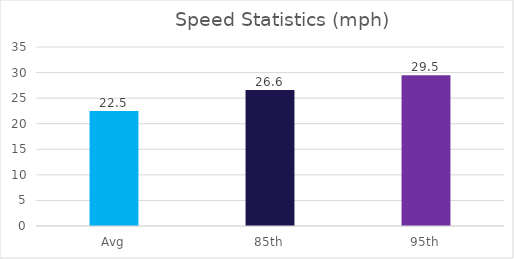
| Category | Series 0 |
|---|---|
| Avg | 22.5 |
| 85th | 26.6 |
| 95th | 29.5 |